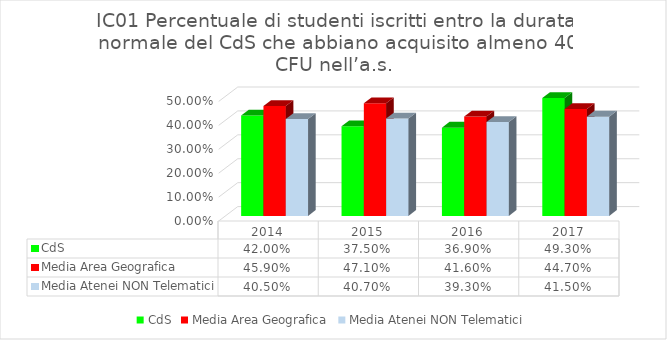
| Category | CdS | Media Area Geografica | Media Atenei NON Telematici |
|---|---|---|---|
| 2014.0 | 0.42 | 0.459 | 0.405 |
| 2015.0 | 0.375 | 0.471 | 0.407 |
| 2016.0 | 0.369 | 0.416 | 0.393 |
| 2017.0 | 0.493 | 0.447 | 0.415 |